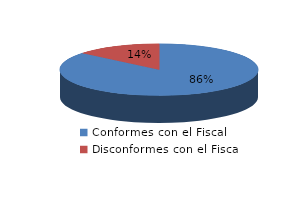
| Category | Series 0 |
|---|---|
| 0 | 258 |
| 1 | 42 |